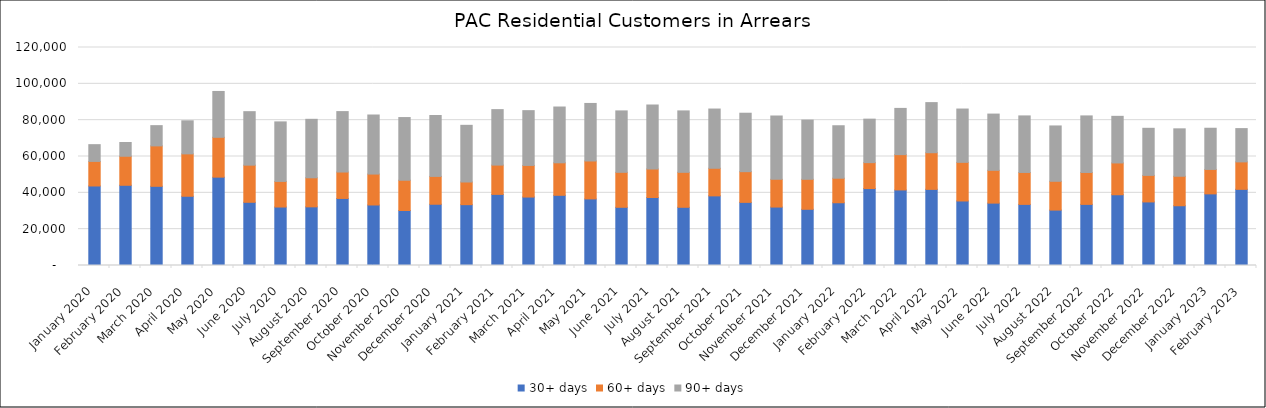
| Category | 30+ days | 60+ days | 90+ days |
|---|---|---|---|
| 2020-01-01 | 43773 | 13520 | 9227 |
| 2020-02-01 | 44154 | 15981 | 7575 |
| 2020-03-01 | 43592 | 22248 | 11145 |
| 2020-04-01 | 38114 | 23336 | 18193 |
| 2020-05-01 | 48633 | 21937 | 25232 |
| 2020-06-01 | 34796 | 20443 | 29438 |
| 2020-07-01 | 32187 | 14096 | 32770 |
| 2020-08-01 | 32287 | 15995 | 32188 |
| 2020-09-01 | 36909 | 14547 | 33261 |
| 2020-10-01 | 33314 | 17018 | 32512 |
| 2020-11-01 | 30268 | 16657 | 34511 |
| 2020-12-01 | 33716 | 15329 | 33513 |
| 2021-01-01 | 33491 | 12475 | 31194 |
| 2021-02-01 | 39145 | 16129 | 30531 |
| 2021-03-01 | 37678 | 17407 | 30155 |
| 2021-04-01 | 38646 | 17888 | 30707 |
| 2021-05-01 | 36659 | 20879 | 31667 |
| 2021-06-01 | 32046 | 19246 | 33806 |
| 2021-07-01 | 37434 | 15710 | 35166 |
| 2021-08-01 | 32046 | 19246 | 33806 |
| 2021-09-01 | 38330 | 15192 | 32608 |
| 2021-10-01 | 34753 | 16900 | 32169 |
| 2021-11-01 | 32170 | 15252 | 34867 |
| 2021-12-01 | 30939 | 16511 | 32597 |
| 2022-01-01 | 34543 | 13506 | 28883 |
| 2022-02-01 | 42349 | 14279 | 23933 |
| 2022-03-01 | 41594 | 19435 | 25447 |
| 2022-04-01 | 41906 | 20179 | 27581 |
| 2022-05-01 | 35516 | 21266 | 29343 |
| 2022-06-01 | 34343 | 18056 | 30952 |
| 2022-07-01 | 33642 | 17570 | 31131 |
| 2022-08-01 | 30495 | 15858 | 30467 |
| 2022-09-01 | 33642 | 17570 | 31131 |
| 2022-10-01 | 38948 | 17507 | 25654 |
| 2022-11-01 | 34994 | 14610 | 25917 |
| 2022-12-01 | 32892 | 16240 | 26094 |
| 2023-01-01 | 39426 | 13458 | 22668 |
| 2023-02-01 | 41920 | 15113 | 18325 |